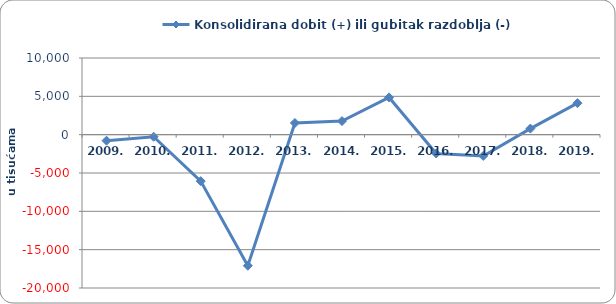
| Category | Konsolidirana dobit (+) ili gubitak razdoblja (-) |
|---|---|
| 2009. | -785 |
| 2010. | -268 |
| 2011. | -6060 |
| 2012. | -17094 |
| 2013. | 1524 |
| 2014. | 1773 |
| 2015. | 4856 |
| 2016. | -2454 |
| 2017. | -2775.85 |
| 2018. | 791.411 |
| 2019. | 4108.088 |